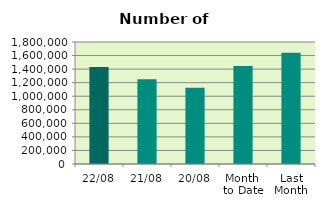
| Category | Series 0 |
|---|---|
| 22/08 | 1432264 |
| 21/08 | 1249684 |
| 20/08 | 1126012 |
| Month 
to Date | 1444927.375 |
| Last
Month | 1640369.455 |